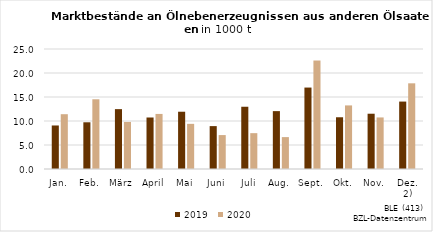
| Category | 2019 | 2020 |
|---|---|---|
| Jan. | 9.067 | 11.417 |
| Feb. | 9.733 | 14.526 |
| März | 12.472 | 9.807 |
| April | 10.73 | 11.473 |
| Mai | 11.932 | 9.407 |
| Juni | 8.936 | 7.068 |
| Juli | 12.969 | 7.468 |
| Aug. | 12.058 | 6.645 |
| Sept. | 16.967 | 22.6 |
| Okt. | 10.779 | 13.246 |
| Nov. | 11.517 | 10.742 |
| Dez. 2) | 14.048 | 17.85 |